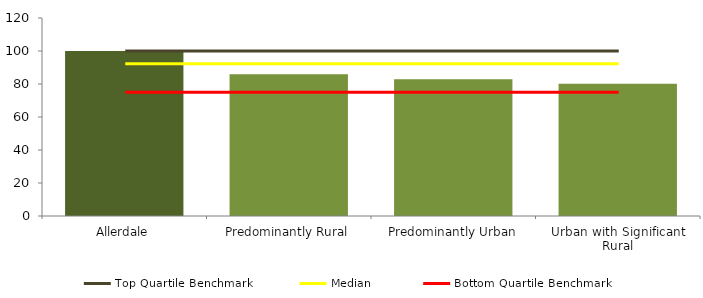
| Category | Series 0 |
|---|---|
| Allerdale | 100 |
| Predominantly Rural | 85.857 |
| Predominantly Urban | 82.901 |
| Urban with Significant Rural | 80.092 |